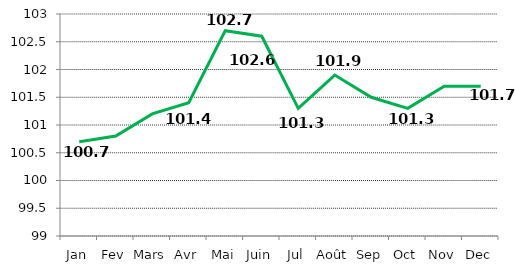
| Category |   INDICE  GENERAL     |
|---|---|
| Jan | 100.7 |
| Fev | 100.8 |
| Mars | 101.2 |
| Avr | 101.4 |
| Mai | 102.7 |
| Juin | 102.6 |
| Jul | 101.3 |
| Août | 101.9 |
| Sep | 101.5 |
| Oct | 101.3 |
| Nov | 101.7 |
| Dec | 101.7 |